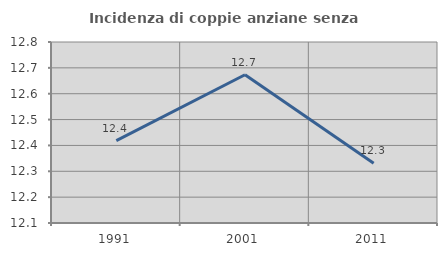
| Category | Incidenza di coppie anziane senza figli  |
|---|---|
| 1991.0 | 12.418 |
| 2001.0 | 12.673 |
| 2011.0 | 12.331 |